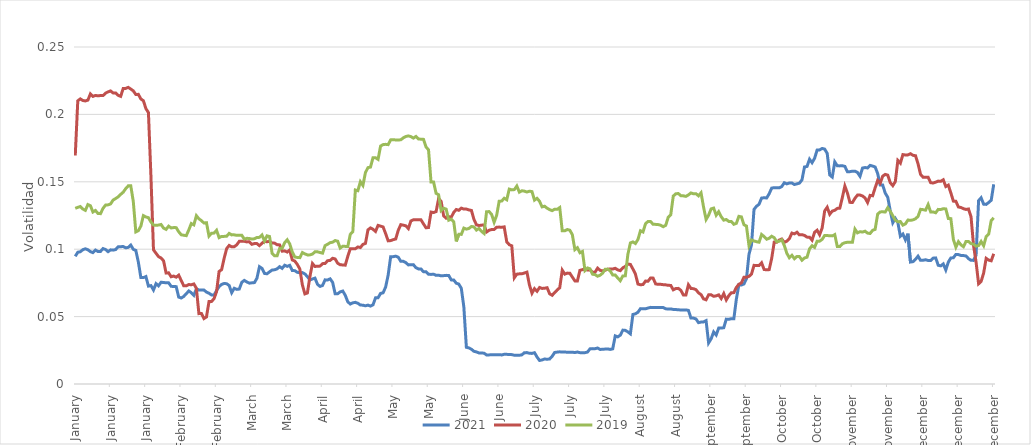
| Category | 2021 | 2020 | 2019 |
|---|---|---|---|
| 2021-01-01 | 0.095 | 0.17 | 0.13 |
| 2021-01-02 | 0.098 | 0.21 | 0.131 |
| 2021-01-03 | 0.098 | 0.212 | 0.132 |
| 2021-01-04 | 0.1 | 0.21 | 0.13 |
| 2021-01-05 | 0.1 | 0.21 | 0.129 |
| 2021-01-06 | 0.1 | 0.211 | 0.133 |
| 2021-01-07 | 0.098 | 0.215 | 0.132 |
| 2021-01-08 | 0.097 | 0.213 | 0.128 |
| 2021-01-09 | 0.099 | 0.214 | 0.129 |
| 2021-01-10 | 0.098 | 0.214 | 0.127 |
| 2021-01-11 | 0.098 | 0.214 | 0.126 |
| 2021-01-12 | 0.1 | 0.214 | 0.13 |
| 2021-01-13 | 0.1 | 0.216 | 0.133 |
| 2021-01-14 | 0.098 | 0.217 | 0.133 |
| 2021-01-15 | 0.099 | 0.217 | 0.134 |
| 2021-01-16 | 0.099 | 0.216 | 0.136 |
| 2021-01-17 | 0.1 | 0.216 | 0.138 |
| 2021-01-18 | 0.102 | 0.214 | 0.139 |
| 2021-01-19 | 0.102 | 0.213 | 0.141 |
| 2021-01-20 | 0.102 | 0.219 | 0.142 |
| 2021-01-21 | 0.101 | 0.219 | 0.145 |
| 2021-01-22 | 0.101 | 0.22 | 0.147 |
| 2021-01-23 | 0.103 | 0.219 | 0.147 |
| 2021-01-24 | 0.1 | 0.217 | 0.135 |
| 2021-01-25 | 0.099 | 0.215 | 0.113 |
| 2021-01-26 | 0.09 | 0.215 | 0.114 |
| 2021-01-27 | 0.079 | 0.211 | 0.117 |
| 2021-01-28 | 0.079 | 0.21 | 0.125 |
| 2021-01-29 | 0.08 | 0.204 | 0.124 |
| 2021-01-30 | 0.073 | 0.201 | 0.123 |
| 2021-01-31 | 0.073 | 0.154 | 0.12 |
| 2021-02-01 | 0.07 | 0.1 | 0.118 |
| 2021-02-02 | 0.074 | 0.097 | 0.118 |
| 2021-02-03 | 0.073 | 0.094 | 0.118 |
| 2021-02-04 | 0.075 | 0.093 | 0.118 |
| 2021-02-05 | 0.075 | 0.091 | 0.116 |
| 2021-02-06 | 0.075 | 0.082 | 0.115 |
| 2021-02-07 | 0.075 | 0.082 | 0.117 |
| 2021-02-08 | 0.073 | 0.08 | 0.116 |
| 2021-02-09 | 0.072 | 0.08 | 0.116 |
| 2021-02-10 | 0.072 | 0.079 | 0.116 |
| 2021-02-11 | 0.064 | 0.081 | 0.113 |
| 2021-02-12 | 0.064 | 0.077 | 0.111 |
| 2021-02-13 | 0.065 | 0.073 | 0.11 |
| 2021-02-14 | 0.067 | 0.073 | 0.11 |
| 2021-02-15 | 0.069 | 0.074 | 0.114 |
| 2021-02-16 | 0.068 | 0.074 | 0.119 |
| 2021-02-17 | 0.066 | 0.074 | 0.118 |
| 2021-02-18 | 0.071 | 0.071 | 0.125 |
| 2021-02-19 | 0.07 | 0.052 | 0.123 |
| 2021-02-20 | 0.07 | 0.052 | 0.121 |
| 2021-02-21 | 0.07 | 0.049 | 0.119 |
| 2021-02-22 | 0.068 | 0.05 | 0.12 |
| 2021-02-23 | 0.067 | 0.061 | 0.11 |
| 2021-02-24 | 0.066 | 0.061 | 0.112 |
| 2021-02-25 | 0.066 | 0.063 | 0.112 |
| 2021-02-26 | 0.069 | 0.069 | 0.114 |
| 2021-02-27 | 0.072 | 0.083 | 0.109 |
| 2021-02-28 | 0.074 | 0.085 | 0.109 |
| 2021-03-01 | 0.075 | 0.093 | 0.11 |
| 2021-03-02 | 0.074 | 0.1 | 0.11 |
| 2021-03-03 | 0.073 | 0.103 | 0.112 |
| 2021-03-04 | 0.068 | 0.102 | 0.111 |
| 2021-03-05 | 0.071 | 0.102 | 0.111 |
| 2021-03-06 | 0.07 | 0.103 | 0.11 |
| 2021-03-07 | 0.07 | 0.106 | 0.11 |
| 2021-03-08 | 0.075 | 0.106 | 0.11 |
| 2021-03-09 | 0.077 | 0.106 | 0.107 |
| 2021-03-10 | 0.076 | 0.105 | 0.108 |
| 2021-03-11 | 0.075 | 0.105 | 0.108 |
| 2021-03-12 | 0.075 | 0.104 | 0.108 |
| 2021-03-13 | 0.075 | 0.104 | 0.108 |
| 2021-03-14 | 0.078 | 0.104 | 0.109 |
| 2021-03-15 | 0.087 | 0.103 | 0.109 |
| 2021-03-16 | 0.086 | 0.104 | 0.111 |
| 2021-03-17 | 0.082 | 0.106 | 0.106 |
| 2021-03-18 | 0.082 | 0.106 | 0.11 |
| 2021-03-19 | 0.083 | 0.106 | 0.109 |
| 2021-03-20 | 0.085 | 0.105 | 0.097 |
| 2021-03-21 | 0.085 | 0.105 | 0.095 |
| 2021-03-22 | 0.085 | 0.103 | 0.095 |
| 2021-03-23 | 0.087 | 0.103 | 0.101 |
| 2021-03-24 | 0.086 | 0.099 | 0.101 |
| 2021-03-25 | 0.088 | 0.099 | 0.105 |
| 2021-03-26 | 0.087 | 0.098 | 0.107 |
| 2021-03-27 | 0.088 | 0.099 | 0.104 |
| 2021-03-28 | 0.084 | 0.092 | 0.098 |
| 2021-03-29 | 0.084 | 0.091 | 0.094 |
| 2021-03-30 | 0.083 | 0.089 | 0.094 |
| 2021-03-31 | 0.083 | 0.085 | 0.094 |
| 2021-04-01 | 0.083 | 0.074 | 0.098 |
| 2021-04-02 | 0.082 | 0.067 | 0.097 |
| 2021-04-03 | 0.08 | 0.068 | 0.096 |
| 2021-04-04 | 0.077 | 0.08 | 0.096 |
| 2021-04-05 | 0.078 | 0.089 | 0.096 |
| 2021-04-06 | 0.079 | 0.087 | 0.098 |
| 2021-04-07 | 0.074 | 0.087 | 0.098 |
| 2021-04-08 | 0.072 | 0.087 | 0.098 |
| 2021-04-09 | 0.073 | 0.089 | 0.097 |
| 2021-04-10 | 0.077 | 0.089 | 0.103 |
| 2021-04-11 | 0.077 | 0.091 | 0.104 |
| 2021-04-12 | 0.078 | 0.092 | 0.105 |
| 2021-04-13 | 0.075 | 0.093 | 0.105 |
| 2021-04-14 | 0.067 | 0.093 | 0.106 |
| 2021-04-15 | 0.067 | 0.09 | 0.106 |
| 2021-04-16 | 0.068 | 0.088 | 0.101 |
| 2021-04-17 | 0.069 | 0.088 | 0.102 |
| 2021-04-18 | 0.066 | 0.088 | 0.102 |
| 2021-04-19 | 0.061 | 0.095 | 0.102 |
| 2021-04-20 | 0.059 | 0.1 | 0.111 |
| 2021-04-21 | 0.06 | 0.1 | 0.113 |
| 2021-04-22 | 0.061 | 0.1 | 0.144 |
| 2021-04-23 | 0.06 | 0.102 | 0.143 |
| 2021-04-24 | 0.059 | 0.101 | 0.15 |
| 2021-04-25 | 0.058 | 0.104 | 0.147 |
| 2021-04-26 | 0.058 | 0.104 | 0.157 |
| 2021-04-27 | 0.059 | 0.114 | 0.161 |
| 2021-04-28 | 0.058 | 0.116 | 0.161 |
| 2021-04-29 | 0.059 | 0.115 | 0.168 |
| 2021-04-30 | 0.064 | 0.113 | 0.168 |
| 2021-05-01 | 0.064 | 0.118 | 0.167 |
| 2021-05-02 | 0.067 | 0.117 | 0.177 |
| 2021-05-03 | 0.068 | 0.117 | 0.178 |
| 2021-05-04 | 0.072 | 0.112 | 0.178 |
| 2021-05-05 | 0.081 | 0.106 | 0.178 |
| 2021-05-06 | 0.094 | 0.106 | 0.181 |
| 2021-05-07 | 0.094 | 0.107 | 0.181 |
| 2021-05-08 | 0.095 | 0.108 | 0.181 |
| 2021-05-09 | 0.094 | 0.114 | 0.181 |
| 2021-05-10 | 0.091 | 0.118 | 0.181 |
| 2021-05-11 | 0.091 | 0.118 | 0.183 |
| 2021-05-12 | 0.09 | 0.117 | 0.184 |
| 2021-05-13 | 0.088 | 0.115 | 0.184 |
| 2021-05-14 | 0.088 | 0.121 | 0.184 |
| 2021-05-15 | 0.089 | 0.122 | 0.182 |
| 2021-05-16 | 0.086 | 0.122 | 0.184 |
| 2021-05-17 | 0.085 | 0.122 | 0.182 |
| 2021-05-18 | 0.085 | 0.122 | 0.182 |
| 2021-05-19 | 0.083 | 0.119 | 0.181 |
| 2021-05-20 | 0.083 | 0.116 | 0.176 |
| 2021-05-21 | 0.081 | 0.116 | 0.174 |
| 2021-05-22 | 0.081 | 0.128 | 0.15 |
| 2021-05-23 | 0.081 | 0.127 | 0.15 |
| 2021-05-24 | 0.081 | 0.128 | 0.141 |
| 2021-05-25 | 0.081 | 0.138 | 0.14 |
| 2021-05-26 | 0.08 | 0.136 | 0.129 |
| 2021-05-27 | 0.08 | 0.125 | 0.13 |
| 2021-05-28 | 0.081 | 0.123 | 0.13 |
| 2021-05-29 | 0.081 | 0.124 | 0.122 |
| 2021-05-30 | 0.077 | 0.124 | 0.122 |
| 2021-05-31 | 0.077 | 0.127 | 0.12 |
| 2021-06-01 | 0.075 | 0.129 | 0.106 |
| 2021-06-02 | 0.074 | 0.129 | 0.111 |
| 2021-06-03 | 0.071 | 0.13 | 0.111 |
| 2021-06-04 | 0.057 | 0.13 | 0.116 |
| 2021-06-05 | 0.027 | 0.13 | 0.115 |
| 2021-06-06 | 0.027 | 0.129 | 0.115 |
| 2021-06-07 | 0.026 | 0.129 | 0.117 |
| 2021-06-08 | 0.024 | 0.122 | 0.117 |
| 2021-06-09 | 0.024 | 0.118 | 0.114 |
| 2021-06-10 | 0.023 | 0.118 | 0.115 |
| 2021-06-11 | 0.023 | 0.118 | 0.113 |
| 2021-06-12 | 0.023 | 0.118 | 0.112 |
| 2021-06-13 | 0.022 | 0.113 | 0.128 |
| 2021-06-14 | 0.022 | 0.114 | 0.128 |
| 2021-06-15 | 0.022 | 0.115 | 0.126 |
| 2021-06-16 | 0.022 | 0.115 | 0.12 |
| 2021-06-17 | 0.022 | 0.116 | 0.125 |
| 2021-06-18 | 0.022 | 0.116 | 0.136 |
| 2021-06-19 | 0.022 | 0.116 | 0.136 |
| 2021-06-20 | 0.022 | 0.117 | 0.138 |
| 2021-06-21 | 0.022 | 0.105 | 0.137 |
| 2021-06-22 | 0.022 | 0.103 | 0.145 |
| 2021-06-23 | 0.022 | 0.102 | 0.144 |
| 2021-06-24 | 0.021 | 0.079 | 0.144 |
| 2021-06-25 | 0.021 | 0.081 | 0.147 |
| 2021-06-26 | 0.021 | 0.082 | 0.142 |
| 2021-06-27 | 0.022 | 0.082 | 0.143 |
| 2021-06-28 | 0.023 | 0.082 | 0.143 |
| 2021-06-29 | 0.023 | 0.083 | 0.142 |
| 2021-06-30 | 0.023 | 0.073 | 0.143 |
| 2021-07-01 | 0.023 | 0.067 | 0.143 |
| 2021-07-02 | 0.023 | 0.071 | 0.136 |
| 2021-07-03 | 0.02 | 0.069 | 0.138 |
| 2021-07-04 | 0.017 | 0.072 | 0.136 |
| 2021-07-05 | 0.018 | 0.071 | 0.131 |
| 2021-07-06 | 0.019 | 0.071 | 0.132 |
| 2021-07-07 | 0.018 | 0.071 | 0.13 |
| 2021-07-08 | 0.019 | 0.067 | 0.129 |
| 2021-07-09 | 0.021 | 0.066 | 0.129 |
| 2021-07-10 | 0.023 | 0.068 | 0.13 |
| 2021-07-11 | 0.024 | 0.07 | 0.13 |
| 2021-07-12 | 0.024 | 0.071 | 0.131 |
| 2021-07-13 | 0.024 | 0.084 | 0.114 |
| 2021-07-14 | 0.024 | 0.082 | 0.114 |
| 2021-07-15 | 0.024 | 0.082 | 0.115 |
| 2021-07-16 | 0.024 | 0.082 | 0.114 |
| 2021-07-17 | 0.024 | 0.079 | 0.111 |
| 2021-07-18 | 0.023 | 0.076 | 0.1 |
| 2021-07-19 | 0.024 | 0.076 | 0.101 |
| 2021-07-20 | 0.023 | 0.084 | 0.097 |
| 2021-07-21 | 0.023 | 0.085 | 0.098 |
| 2021-07-22 | 0.023 | 0.085 | 0.084 |
| 2021-07-23 | 0.024 | 0.085 | 0.086 |
| 2021-07-24 | 0.026 | 0.085 | 0.085 |
| 2021-07-25 | 0.026 | 0.083 | 0.081 |
| 2021-07-26 | 0.026 | 0.083 | 0.081 |
| 2021-07-27 | 0.027 | 0.086 | 0.08 |
| 2021-07-28 | 0.026 | 0.084 | 0.081 |
| 2021-07-29 | 0.026 | 0.084 | 0.082 |
| 2021-07-30 | 0.026 | 0.084 | 0.085 |
| 2021-07-31 | 0.026 | 0.085 | 0.085 |
| 2021-08-01 | 0.026 | 0.085 | 0.084 |
| 2021-08-02 | 0.026 | 0.085 | 0.081 |
| 2021-08-03 | 0.036 | 0.086 | 0.081 |
| 2021-08-04 | 0.035 | 0.085 | 0.079 |
| 2021-08-05 | 0.036 | 0.084 | 0.077 |
| 2021-08-06 | 0.04 | 0.086 | 0.08 |
| 2021-08-07 | 0.04 | 0.087 | 0.08 |
| 2021-08-08 | 0.039 | 0.089 | 0.096 |
| 2021-08-09 | 0.037 | 0.089 | 0.105 |
| 2021-08-10 | 0.052 | 0.085 | 0.105 |
| 2021-08-11 | 0.052 | 0.082 | 0.104 |
| 2021-08-12 | 0.053 | 0.074 | 0.107 |
| 2021-08-13 | 0.056 | 0.074 | 0.114 |
| 2021-08-14 | 0.056 | 0.074 | 0.113 |
| 2021-08-15 | 0.056 | 0.076 | 0.119 |
| 2021-08-16 | 0.056 | 0.076 | 0.121 |
| 2021-08-17 | 0.057 | 0.079 | 0.121 |
| 2021-08-18 | 0.057 | 0.079 | 0.118 |
| 2021-08-19 | 0.057 | 0.074 | 0.118 |
| 2021-08-20 | 0.057 | 0.074 | 0.118 |
| 2021-08-21 | 0.057 | 0.074 | 0.118 |
| 2021-08-22 | 0.057 | 0.074 | 0.117 |
| 2021-08-23 | 0.056 | 0.074 | 0.118 |
| 2021-08-24 | 0.056 | 0.073 | 0.124 |
| 2021-08-25 | 0.056 | 0.073 | 0.126 |
| 2021-08-26 | 0.055 | 0.07 | 0.139 |
| 2021-08-27 | 0.055 | 0.071 | 0.141 |
| 2021-08-28 | 0.055 | 0.071 | 0.141 |
| 2021-08-29 | 0.055 | 0.069 | 0.14 |
| 2021-08-30 | 0.055 | 0.066 | 0.14 |
| 2021-08-31 | 0.055 | 0.066 | 0.139 |
| 2021-09-01 | 0.055 | 0.074 | 0.14 |
| 2021-09-02 | 0.049 | 0.071 | 0.142 |
| 2021-09-03 | 0.049 | 0.071 | 0.141 |
| 2021-09-04 | 0.048 | 0.07 | 0.141 |
| 2021-09-05 | 0.046 | 0.068 | 0.14 |
| 2021-09-06 | 0.046 | 0.066 | 0.142 |
| 2021-09-07 | 0.046 | 0.063 | 0.131 |
| 2021-09-08 | 0.047 | 0.062 | 0.122 |
| 2021-09-09 | 0.03 | 0.066 | 0.125 |
| 2021-09-10 | 0.034 | 0.066 | 0.13 |
| 2021-09-11 | 0.039 | 0.065 | 0.13 |
| 2021-09-12 | 0.036 | 0.065 | 0.125 |
| 2021-09-13 | 0.041 | 0.066 | 0.128 |
| 2021-09-14 | 0.041 | 0.063 | 0.124 |
| 2021-09-15 | 0.042 | 0.067 | 0.122 |
| 2021-09-16 | 0.048 | 0.062 | 0.122 |
| 2021-09-17 | 0.048 | 0.066 | 0.121 |
| 2021-09-18 | 0.048 | 0.068 | 0.121 |
| 2021-09-19 | 0.048 | 0.068 | 0.118 |
| 2021-09-20 | 0.063 | 0.072 | 0.119 |
| 2021-09-21 | 0.074 | 0.074 | 0.124 |
| 2021-09-22 | 0.073 | 0.075 | 0.124 |
| 2021-09-23 | 0.074 | 0.079 | 0.118 |
| 2021-09-24 | 0.078 | 0.079 | 0.117 |
| 2021-09-25 | 0.096 | 0.08 | 0.103 |
| 2021-09-26 | 0.103 | 0.082 | 0.107 |
| 2021-09-27 | 0.13 | 0.088 | 0.106 |
| 2021-09-28 | 0.132 | 0.088 | 0.106 |
| 2021-09-29 | 0.133 | 0.088 | 0.105 |
| 2021-09-30 | 0.138 | 0.09 | 0.111 |
| 2021-10-01 | 0.138 | 0.085 | 0.109 |
| 2021-10-02 | 0.138 | 0.085 | 0.107 |
| 2021-10-03 | 0.141 | 0.085 | 0.108 |
| 2021-10-04 | 0.145 | 0.093 | 0.11 |
| 2021-10-05 | 0.146 | 0.105 | 0.109 |
| 2021-10-06 | 0.146 | 0.105 | 0.106 |
| 2021-10-07 | 0.146 | 0.107 | 0.106 |
| 2021-10-08 | 0.146 | 0.108 | 0.107 |
| 2021-10-09 | 0.149 | 0.105 | 0.103 |
| 2021-10-10 | 0.148 | 0.106 | 0.097 |
| 2021-10-11 | 0.149 | 0.108 | 0.094 |
| 2021-10-12 | 0.149 | 0.112 | 0.095 |
| 2021-10-13 | 0.148 | 0.111 | 0.093 |
| 2021-10-14 | 0.148 | 0.113 | 0.095 |
| 2021-10-15 | 0.149 | 0.111 | 0.095 |
| 2021-10-16 | 0.151 | 0.111 | 0.092 |
| 2021-10-17 | 0.161 | 0.11 | 0.093 |
| 2021-10-18 | 0.161 | 0.109 | 0.094 |
| 2021-10-19 | 0.167 | 0.109 | 0.1 |
| 2021-10-20 | 0.164 | 0.107 | 0.103 |
| 2021-10-21 | 0.167 | 0.113 | 0.101 |
| 2021-10-22 | 0.174 | 0.114 | 0.106 |
| 2021-10-23 | 0.174 | 0.111 | 0.106 |
| 2021-10-24 | 0.175 | 0.116 | 0.107 |
| 2021-10-25 | 0.174 | 0.128 | 0.11 |
| 2021-10-26 | 0.171 | 0.131 | 0.11 |
| 2021-10-27 | 0.155 | 0.126 | 0.11 |
| 2021-10-28 | 0.154 | 0.128 | 0.11 |
| 2021-10-29 | 0.165 | 0.129 | 0.111 |
| 2021-10-30 | 0.162 | 0.13 | 0.102 |
| 2021-10-31 | 0.162 | 0.13 | 0.102 |
| 2021-11-01 | 0.162 | 0.138 | 0.104 |
| 2021-11-02 | 0.161 | 0.147 | 0.105 |
| 2021-11-03 | 0.157 | 0.142 | 0.105 |
| 2021-11-04 | 0.158 | 0.135 | 0.105 |
| 2021-11-05 | 0.158 | 0.135 | 0.105 |
| 2021-11-06 | 0.158 | 0.138 | 0.115 |
| 2021-11-07 | 0.157 | 0.14 | 0.112 |
| 2021-11-08 | 0.154 | 0.14 | 0.113 |
| 2021-11-09 | 0.16 | 0.139 | 0.113 |
| 2021-11-10 | 0.161 | 0.138 | 0.113 |
| 2021-11-11 | 0.16 | 0.135 | 0.112 |
| 2021-11-12 | 0.162 | 0.14 | 0.112 |
| 2021-11-13 | 0.162 | 0.14 | 0.114 |
| 2021-11-14 | 0.161 | 0.146 | 0.115 |
| 2021-11-15 | 0.156 | 0.151 | 0.126 |
| 2021-11-16 | 0.148 | 0.149 | 0.128 |
| 2021-11-17 | 0.148 | 0.154 | 0.128 |
| 2021-11-18 | 0.142 | 0.155 | 0.128 |
| 2021-11-19 | 0.139 | 0.155 | 0.131 |
| 2021-11-20 | 0.128 | 0.149 | 0.128 |
| 2021-11-21 | 0.12 | 0.147 | 0.125 |
| 2021-11-22 | 0.123 | 0.15 | 0.121 |
| 2021-11-23 | 0.12 | 0.166 | 0.12 |
| 2021-11-24 | 0.11 | 0.164 | 0.121 |
| 2021-11-25 | 0.111 | 0.17 | 0.118 |
| 2021-11-26 | 0.107 | 0.17 | 0.119 |
| 2021-11-27 | 0.112 | 0.17 | 0.122 |
| 2021-11-28 | 0.09 | 0.171 | 0.121 |
| 2021-11-29 | 0.091 | 0.17 | 0.122 |
| 2021-11-30 | 0.092 | 0.169 | 0.123 |
| 2021-12-01 | 0.095 | 0.163 | 0.124 |
| 2021-12-02 | 0.092 | 0.156 | 0.13 |
| 2021-12-03 | 0.092 | 0.153 | 0.129 |
| 2021-12-04 | 0.092 | 0.153 | 0.129 |
| 2021-12-05 | 0.092 | 0.153 | 0.133 |
| 2021-12-06 | 0.092 | 0.149 | 0.128 |
| 2021-12-07 | 0.093 | 0.149 | 0.128 |
| 2021-12-08 | 0.094 | 0.15 | 0.127 |
| 2021-12-09 | 0.088 | 0.151 | 0.13 |
| 2021-12-10 | 0.088 | 0.15 | 0.129 |
| 2021-12-11 | 0.089 | 0.152 | 0.13 |
| 2021-12-12 | 0.085 | 0.146 | 0.13 |
| 2021-12-13 | 0.09 | 0.148 | 0.123 |
| 2021-12-14 | 0.093 | 0.142 | 0.123 |
| 2021-12-15 | 0.094 | 0.136 | 0.107 |
| 2021-12-16 | 0.096 | 0.136 | 0.102 |
| 2021-12-17 | 0.096 | 0.131 | 0.106 |
| 2021-12-18 | 0.095 | 0.131 | 0.103 |
| 2021-12-19 | 0.095 | 0.13 | 0.102 |
| 2021-12-20 | 0.095 | 0.129 | 0.106 |
| 2021-12-21 | 0.093 | 0.13 | 0.106 |
| 2021-12-22 | 0.092 | 0.124 | 0.104 |
| 2021-12-23 | 0.092 | 0.103 | 0.104 |
| 2021-12-24 | 0.096 | 0.09 | 0.102 |
| 2021-12-25 | 0.136 | 0.074 | 0.103 |
| 2021-12-26 | 0.138 | 0.076 | 0.106 |
| 2021-12-27 | 0.133 | 0.082 | 0.103 |
| 2021-12-28 | 0.133 | 0.093 | 0.109 |
| 2021-12-29 | 0.135 | 0.092 | 0.111 |
| 2021-12-30 | 0.136 | 0.091 | 0.121 |
| 2021-12-31 | 0.148 | 0.097 | 0.123 |